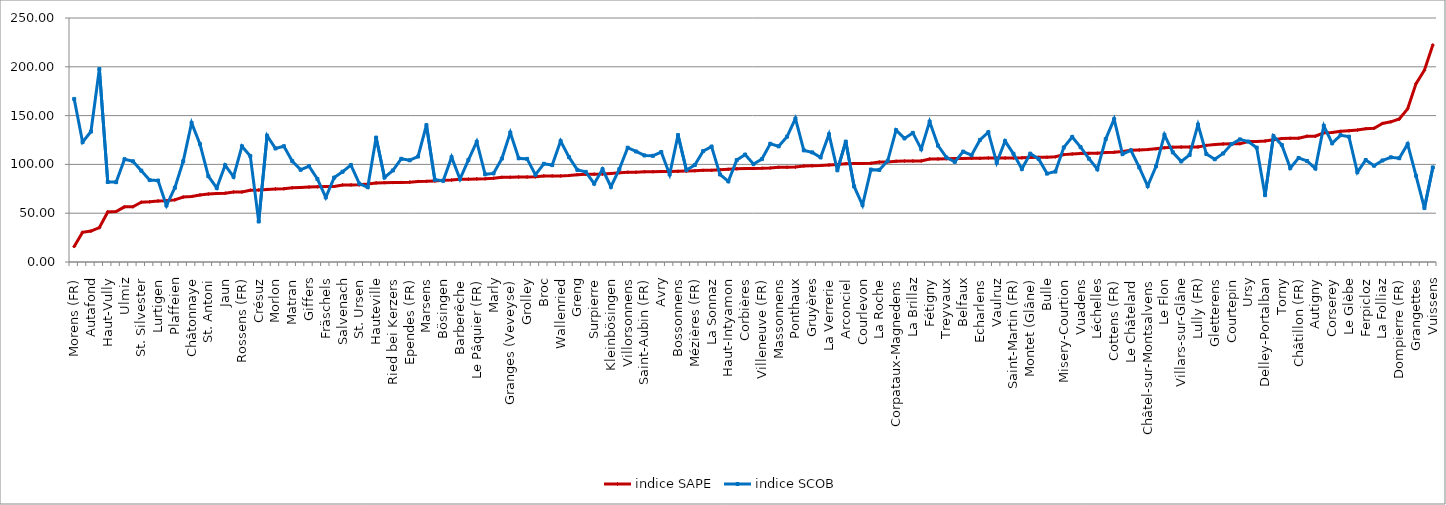
| Category | indice SAPE | indice SCOB |
|---|---|---|
| Morens (FR) | 15.846 | 167.06 |
| Pierrafortscha | 30.407 | 122.887 |
| Autafond | 31.692 | 133.648 |
| Prévondavaux | 35.158 | 197.687 |
| Haut-Vully | 51.289 | 81.982 |
| Villarsel-sur-Marly | 51.727 | 81.802 |
| Ulmiz | 56.535 | 105.301 |
| Galmiz | 56.607 | 103.195 |
| St. Silvester | 61.26 | 93.565 |
| Meyriez | 61.647 | 83.949 |
| Lurtigen | 62.503 | 83.468 |
| Gempenach | 62.721 | 57.86 |
| Plaffeien | 63.661 | 76.065 |
| Bussy (FR) | 66.506 | 103.226 |
| Châtonnaye | 67.076 | 142.506 |
| Chapelle (Glâne) | 68.706 | 120.725 |
| St. Antoni | 69.579 | 87.861 |
| Zumholz | 70.147 | 75.851 |
| Jaun | 70.526 | 99.139 |
| Val-de-Charmey | 71.69 | 87.338 |
| Rossens (FR) | 71.774 | 118.549 |
| Senèdes | 73.533 | 108.534 |
| Crésuz | 73.774 | 41.482 |
| Pont-la-Ville | 74.384 | 129.395 |
| Morlon | 74.872 | 116.327 |
| Jeuss | 75.004 | 118.612 |
| Matran | 76.056 | 103.382 |
| Bas-Vully | 76.369 | 94.516 |
| Giffers | 76.743 | 98.169 |
| Tentlingen | 77.021 | 85.068 |
| Fräschels | 77.257 | 66.179 |
| Ecublens (FR) | 77.348 | 86.488 |
| Salvenach | 78.951 | 92.485 |
| Rechthalten | 78.951 | 99.3 |
| St. Ursen | 79.044 | 80.248 |
| Plasselb | 79.822 | 76.573 |
| Hauteville | 81.05 | 127.496 |
| Muntelier | 81.3 | 86.554 |
| Ried bei Kerzers | 81.329 | 93.805 |
| Oberschrot | 81.54 | 105.752 |
| Ependes (FR) | 81.822 | 104.235 |
| Corminboeuf | 82.573 | 108.093 |
| Marsens | 82.668 | 140.265 |
| Düdingen | 83.087 | 84.296 |
| Bösingen | 83.64 | 83.161 |
| Billens-Hennens | 83.959 | 107.4 |
| Barberêche | 84.75 | 84.883 |
| Cheiry | 84.91 | 104.439 |
| Le Pâquier (FR) | 85.139 | 123.243 |
| Chésopelloz | 85.231 | 89.858 |
| Marly | 85.81 | 90.768 |
| Ueberstorf | 86.724 | 106.007 |
| Granges (Veveyse) | 86.856 | 132.586 |
| Le Mouret | 87.025 | 106.263 |
| Grolley | 87.093 | 105.657 |
| Tafers | 87.23 | 89.452 |
| Broc | 88.204 | 100.583 |
| Gurmels | 88.218 | 99.285 |
| Wallenried | 88.24 | 124.039 |
| Vernay | 88.57 | 107.459 |
| Greng | 89.493 | 94.351 |
| Brünisried | 89.866 | 92.315 |
| Surpierre | 90.004 | 80.291 |
| Murten | 90.143 | 95.036 |
| Kleinbösingen | 90.761 | 77.081 |
| Kerzers | 91.437 | 95.075 |
| Villorsonnens | 91.947 | 117.058 |
| Pont-en-Ogoz | 92.056 | 113.228 |
| Saint-Aubin (FR) | 92.49 | 109.191 |
| Chénens | 92.558 | 108.798 |
| Avry | 92.637 | 112.658 |
| Wünnewil-Flamatt | 92.848 | 89.657 |
| Bossonnens | 92.902 | 130.039 |
| Heitenried | 93.142 | 94.178 |
| Mézières (FR) | 93.476 | 99.332 |
| Cugy (FR) | 93.879 | 113.637 |
| La Sonnaz | 93.937 | 118.228 |
| Alterswil | 94.457 | 89.705 |
| Haut-Intyamon | 94.987 | 82.632 |
| Cressier (FR) | 95.524 | 104.439 |
| Corbières | 95.688 | 110.053 |
| Romont (FR) | 95.923 | 100.334 |
| Villeneuve (FR) | 96.005 | 105.433 |
| Villarepos | 96.38 | 121.153 |
| Massonnens | 97.027 | 118.531 |
| Nuvilly | 97.086 | 128.446 |
| Ponthaux | 97.267 | 146.984 |
| Villaz-Saint-Pierre | 98.407 | 114.389 |
| Gruyères | 98.584 | 112.311 |
| Auboranges | 98.906 | 107.171 |
| La Verrerie | 99.442 | 130.878 |
| Prez-vers-Noréaz | 99.953 | 93.942 |
| Arconciel | 100.708 | 123.365 |
| Fribourg | 100.905 | 77.398 |
| Courlevon | 100.966 | 58.292 |
| Estavayer-le-Lac | 101.17 | 94.724 |
| La Roche | 102.345 | 94.348 |
| Rue | 102.569 | 103.631 |
| Corpataux-Magnedens | 103.249 | 135.128 |
| Châbles | 103.417 | 126.652 |
| La Brillaz | 103.468 | 132.303 |
| Semsales | 103.569 | 115.648 |
| Fétigny | 105.474 | 143.853 |
| Neyruz (FR) | 105.577 | 119.258 |
| Treyvaux | 105.741 | 107.109 |
| Riaz | 105.958 | 102.576 |
| Belfaux | 106.038 | 113.115 |
| Montagny (FR) | 106.176 | 109.428 |
| Echarlens | 106.191 | 125.067 |
| Remaufens | 106.501 | 132.986 |
| Vaulruz | 106.527 | 101.613 |
| Domdidier | 106.528 | 123.891 |
| Saint-Martin (FR) | 106.619 | 110.845 |
| Schmitten (FR) | 106.72 | 95.34 |
| Montet (Glâne) | 107.148 | 110.982 |
| Châtel-Saint-Denis | 107.216 | 105.601 |
| Bulle | 107.405 | 90.565 |
| Courgevaux | 107.78 | 92.652 |
| Misery-Courtion | 110.023 | 117.41 |
| Attalens | 110.661 | 128.135 |
| Vuadens | 111.28 | 117.679 |
| Sorens | 111.305 | 105.842 |
| Léchelles | 111.492 | 94.985 |
| Hauterive (FR) | 112.173 | 125.945 |
| Cottens (FR) | 112.426 | 146.353 |
| Farvagny | 113.128 | 110.515 |
| Le Châtelard | 114.617 | 114.478 |
| Siviriez | 114.812 | 96.907 |
| Châtel-sur-Montsalvens | 115.163 | 77.83 |
| Cheyres | 116.037 | 98.105 |
| Le Flon | 117.092 | 130.306 |
| Murist | 117.653 | 112.41 |
| Villars-sur-Glâne | 117.759 | 103.098 |
| Vallon | 117.807 | 109.711 |
| Lully (FR) | 117.863 | 140.829 |
| Grandvillard | 119.501 | 110.623 |
| Gletterens | 120.289 | 105.267 |
| Les Montets | 120.956 | 111.217 |
| Courtepin | 121.054 | 120.827 |
| Vuisternens-devant-Romont | 121.257 | 125.616 |
| Ursy | 123.396 | 123.4 |
| Sâles | 123.463 | 117.148 |
| Delley-Portalban | 124.022 | 68.49 |
| Botterens | 125.246 | 129.009 |
| Torny | 126.585 | 119.838 |
| Bas-Intyamon | 126.741 | 96.181 |
| Châtillon (FR) | 126.844 | 106.596 |
| Noréaz | 128.893 | 103.535 |
| Autigny | 128.913 | 95.755 |
| Sévaz | 132.359 | 139.544 |
| Corserey | 132.699 | 121.654 |
| Ménières | 133.859 | 129.925 |
| Le Glèbe | 134.498 | 128.385 |
| Givisiez | 135.178 | 91.994 |
| Ferpicloz | 136.614 | 104.492 |
| Granges-Paccot | 137.096 | 98.652 |
| La Folliaz | 141.986 | 104.024 |
| Rueyres-les-Prés | 143.624 | 107.256 |
| Dompierre (FR) | 146.485 | 106.333 |
| Vuisternens-en-Ogoz | 156.931 | 120.843 |
| Grangettes | 182.75 | 88.307 |
| Russy | 196.516 | 55.249 |
| Vuissens | 222.343 | 96.89 |